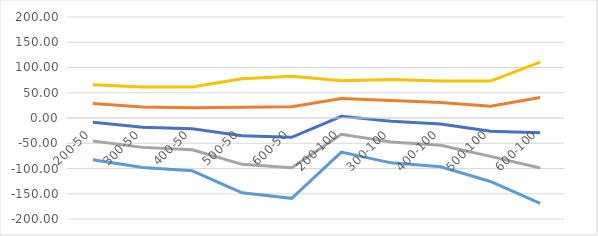
| Category | TchMax | Plus | Minus | 2x+ | 2x- |
|---|---|---|---|---|---|
| 200-50 | -8.43 | 28.621 | -45.482 | 65.673 | -82.533 |
| 300-50 | -18.302 | 21.567 | -58.172 | 61.437 | -98.042 |
| 400-50 | -21.444 | 20.076 | -62.963 | 61.596 | -104.483 |
| 500-50 | -35.318 | 21.1 | -91.736 | 77.518 | -148.154 |
| 600-50 | -38.214 | 22.24 | -98.668 | 82.694 | -159.122 |
| 200-100 | 3.224 | 38.583 | -32.136 | 73.942 | -67.495 |
| 300-100 | -6.397 | 34.823 | -47.617 | 76.042 | -88.836 |
| 400-100 | -11.671 | 30.758 | -54.1 | 73.187 | -96.529 |
| 500-100 | -26.321 | 23.361 | -76.004 | 73.044 | -125.686 |
| 600-100 | -29.231 | 40.663 | -99.124 | 110.556 | -169.017 |